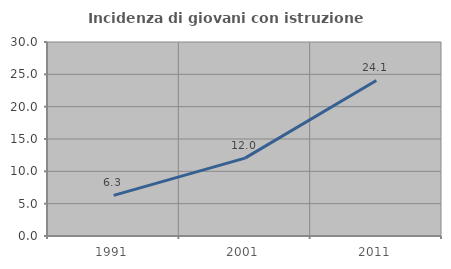
| Category | Incidenza di giovani con istruzione universitaria |
|---|---|
| 1991.0 | 6.278 |
| 2001.0 | 12.04 |
| 2011.0 | 24.051 |